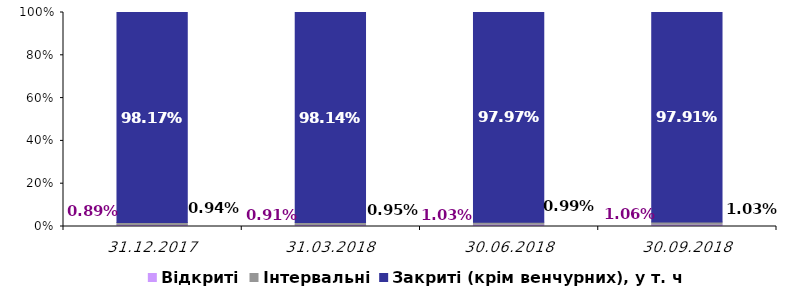
| Category | Відкриті | Інтервальні | Закриті (крім венчурних), у т. ч.: |
|---|---|---|---|
| 31.12.2017 | 0.009 | 0.009 | 0.982 |
| 31.03.2018 | 0.009 | 0.009 | 0.981 |
| 30.06.2018 | 0.01 | 0.01 | 0.98 |
| 30.09.2018 | 0.011 | 0.01 | 0.979 |